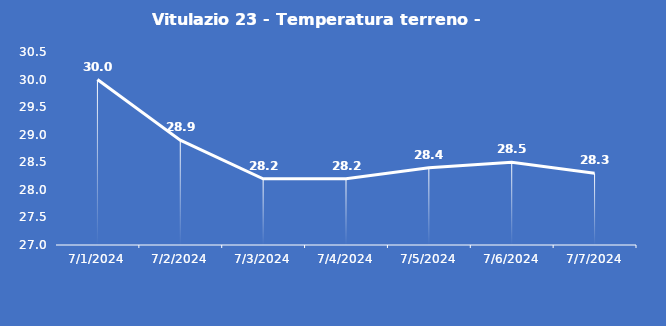
| Category | Vitulazio 23 - Temperatura terreno - Grezzo (°C) |
|---|---|
| 7/1/24 | 30 |
| 7/2/24 | 28.9 |
| 7/3/24 | 28.2 |
| 7/4/24 | 28.2 |
| 7/5/24 | 28.4 |
| 7/6/24 | 28.5 |
| 7/7/24 | 28.3 |